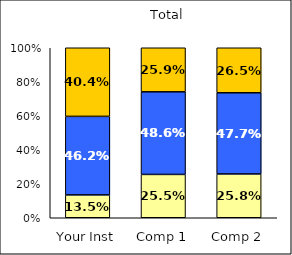
| Category | Low Job Satisfaction: Compensation | Average Job Satisfaction: Compensation | High Job Satisfaction: Compensation |
|---|---|---|---|
| Your Inst | 0.135 | 0.462 | 0.404 |
| Comp 1 | 0.255 | 0.486 | 0.259 |
| Comp 2 | 0.258 | 0.477 | 0.265 |